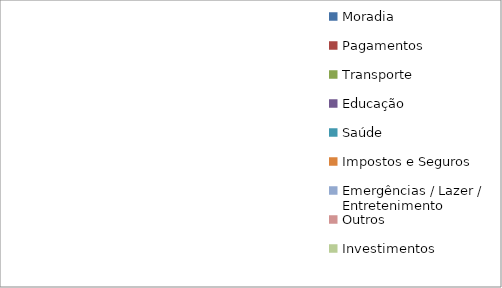
| Category | Series 0 |
|---|---|
| Moradia | 0 |
| Pagamentos | 0 |
| Transporte | 0 |
| Educação | 0 |
| Saúde | 0 |
| Impostos e Seguros | 0 |
| Emergências / Lazer / Entretenimento | 0 |
| Outros | 0 |
| Investimentos | 0 |